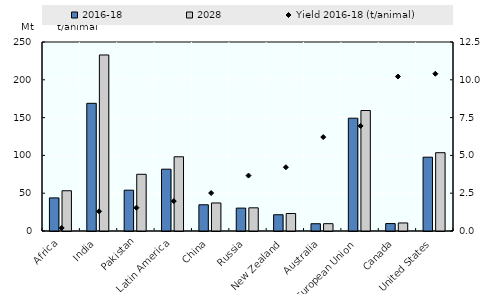
| Category | 2016-18 | 2028 |
|---|---|---|
| Africa | 43.779 | 53.245 |
| India | 168.894 | 232.835 |
| Pakistan | 54.004 | 75.012 |
| Latin America | 81.756 | 98.155 |
| China | 34.689 | 37.076 |
| Russia | 30.284 | 30.666 |
| New Zealand | 21.514 | 23.15 |
| Australia | 9.618 | 9.682 |
| European Union | 149.218 | 159.384 |
| Canada | 9.833 | 10.631 |
| United States | 97.628 | 103.587 |